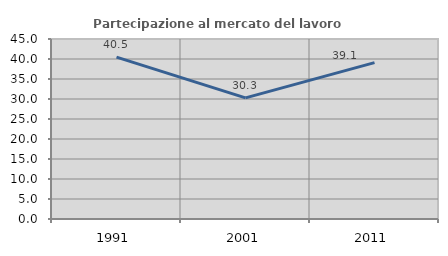
| Category | Partecipazione al mercato del lavoro  femminile |
|---|---|
| 1991.0 | 40.454 |
| 2001.0 | 30.29 |
| 2011.0 | 39.101 |